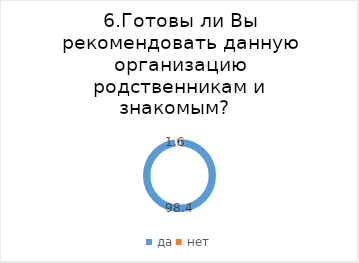
| Category | Series 0 |
|---|---|
| да | 98.355 |
| нет | 1.645 |